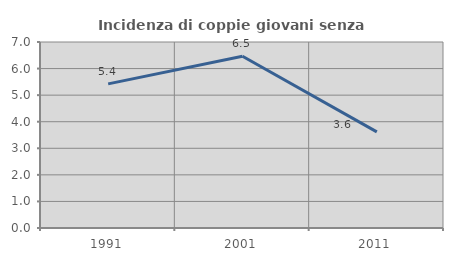
| Category | Incidenza di coppie giovani senza figli |
|---|---|
| 1991.0 | 5.423 |
| 2001.0 | 6.464 |
| 2011.0 | 3.617 |